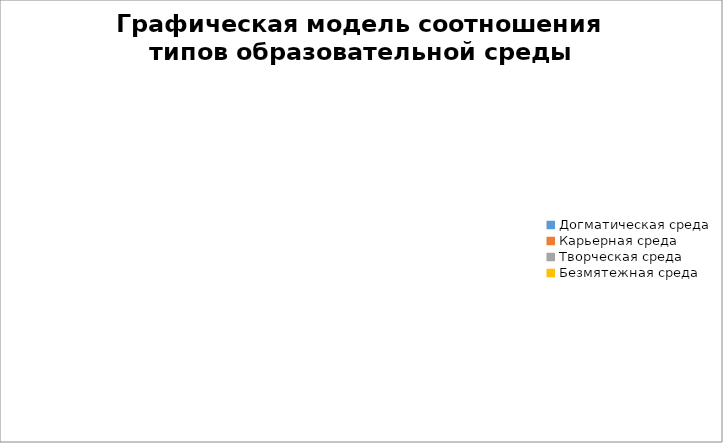
| Category | Графическая модель соотношения типов образовательной среды |
|---|---|
| Догматическая среда | 0 |
| Карьерная среда | 0 |
| Творческая среда | 0 |
| Безмятежная среда | 0 |